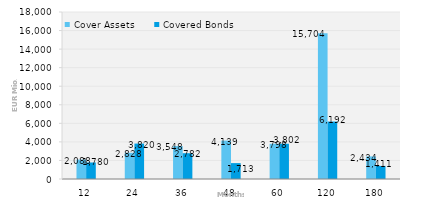
| Category | Cover Assets | Covered Bonds |
|---|---|---|
| 12.0 | 2087.928 | 1779.657 |
| 24.0 | 2828.144 | 3820 |
| 36.0 | 3548.38 | 2781.5 |
| 48.0 | 4138.636 | 1713 |
| 60.0 | 3798.125 | 3801.5 |
| 120.0 | 15704.402 | 6191.5 |
| 180.0 | 2434.235 | 1411 |